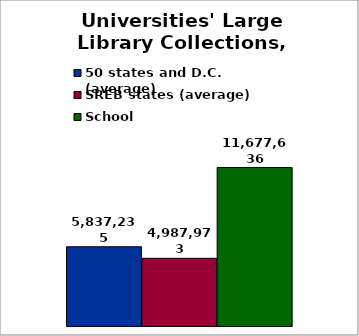
| Category | 50 states and D.C. (average) | SREB states (average) | School |
|---|---|---|---|
| 0 | 5837235 | 4987972.967 | 11677636 |